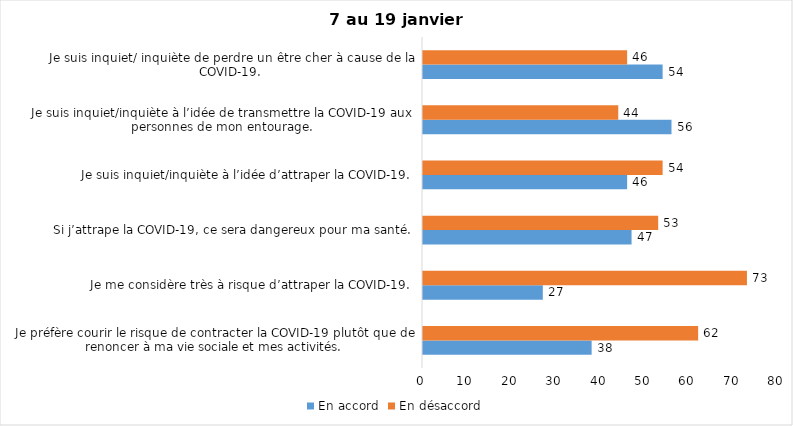
| Category | En accord | En désaccord |
|---|---|---|
| Je préfère courir le risque de contracter la COVID-19 plutôt que de renoncer à ma vie sociale et mes activités. | 38 | 62 |
| Je me considère très à risque d’attraper la COVID-19. | 27 | 73 |
| Si j’attrape la COVID-19, ce sera dangereux pour ma santé. | 47 | 53 |
| Je suis inquiet/inquiète à l’idée d’attraper la COVID-19. | 46 | 54 |
| Je suis inquiet/inquiète à l’idée de transmettre la COVID-19 aux personnes de mon entourage. | 56 | 44 |
| Je suis inquiet/ inquiète de perdre un être cher à cause de la COVID-19. | 54 | 46 |